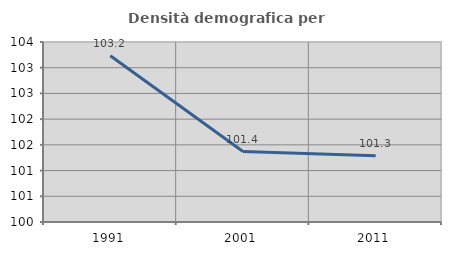
| Category | Densità demografica |
|---|---|
| 1991.0 | 103.234 |
| 2001.0 | 101.37 |
| 2011.0 | 101.29 |